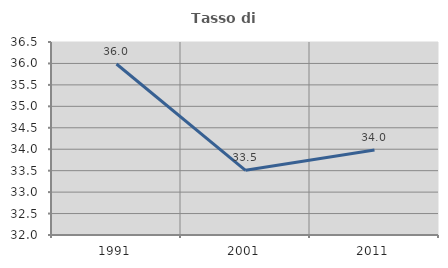
| Category | Tasso di occupazione   |
|---|---|
| 1991.0 | 35.987 |
| 2001.0 | 33.509 |
| 2011.0 | 33.981 |